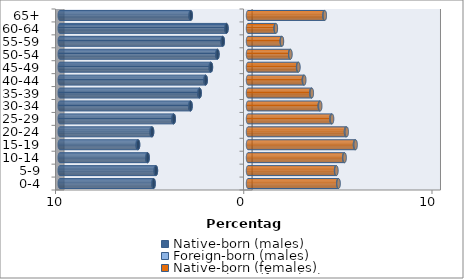
| Category | Native-born (males) | Foreign-born (males) | Native-born (females) | Foreign-born (females) |
|---|---|---|---|---|
| 0-4 | -5.013 | -0.017 | 4.796 | 0.016 |
| 5-9 | -4.89 | -0.02 | 4.677 | 0.02 |
| 10-14 | -5.33 | -0.025 | 5.108 | 0.027 |
| 15-19 | -5.838 | -0.034 | 5.682 | 0.038 |
| 20-24 | -5.094 | -0.039 | 5.204 | 0.045 |
| 25-29 | -3.942 | -0.032 | 4.432 | 0.036 |
| 30-34 | -3.05 | -0.026 | 3.812 | 0.028 |
| 35-39 | -2.566 | -0.026 | 3.365 | 0.028 |
| 40-44 | -2.246 | -0.023 | 2.967 | 0.025 |
| 45-49 | -1.969 | -0.019 | 2.66 | 0.021 |
| 50-54 | -1.622 | -0.013 | 2.239 | 0.015 |
| 55-59 | -1.338 | -0.01 | 1.794 | 0.012 |
| 60-64 | -1.142 | -0.008 | 1.471 | 0.009 |
| 65+ | -3.039 | -0.018 | 4.058 | 0.024 |